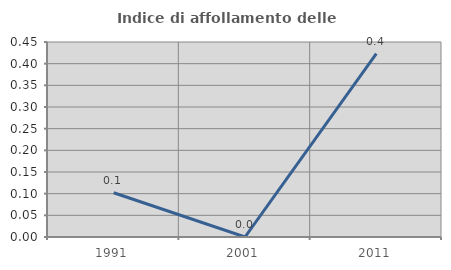
| Category | Indice di affollamento delle abitazioni  |
|---|---|
| 1991.0 | 0.102 |
| 2001.0 | 0 |
| 2011.0 | 0.423 |